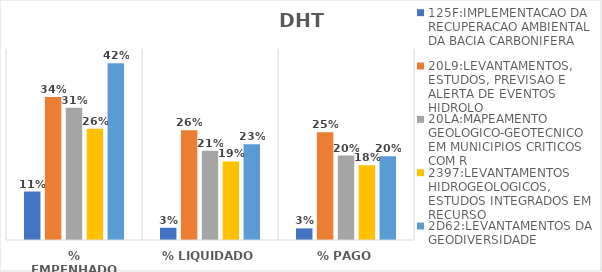
| Category | 125F:IMPLEMENTACAO DA RECUPERACAO AMBIENTAL DA BACIA CARBONIFERA | 20L9:LEVANTAMENTOS, ESTUDOS, PREVISAO E ALERTA DE EVENTOS HIDROLO | 20LA:MAPEAMENTO GEOLOGICO-GEOTECNICO EM MUNICIPIOS CRITICOS COM R | 2397:LEVANTAMENTOS HIDROGEOLOGICOS, ESTUDOS INTEGRADOS EM RECURSO | 2D62:LEVANTAMENTOS DA GEODIVERSIDADE |
|---|---|---|---|---|---|
| % EMPENHADO | 0.114 | 0.337 | 0.312 | 0.262 | 0.417 |
| % LIQUIDADO | 0.029 | 0.259 | 0.21 | 0.185 | 0.226 |
| % PAGO | 0.027 | 0.254 | 0.199 | 0.176 | 0.197 |